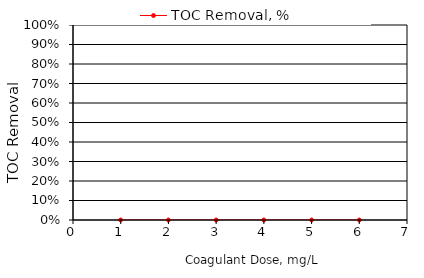
| Category | TOC Removal, % |
|---|---|
| 0.0 | 0 |
| 0.0 | 0 |
| 0.0 | 0 |
| 0.0 | 0 |
| 0.0 | 0 |
| 0.0 | 0 |